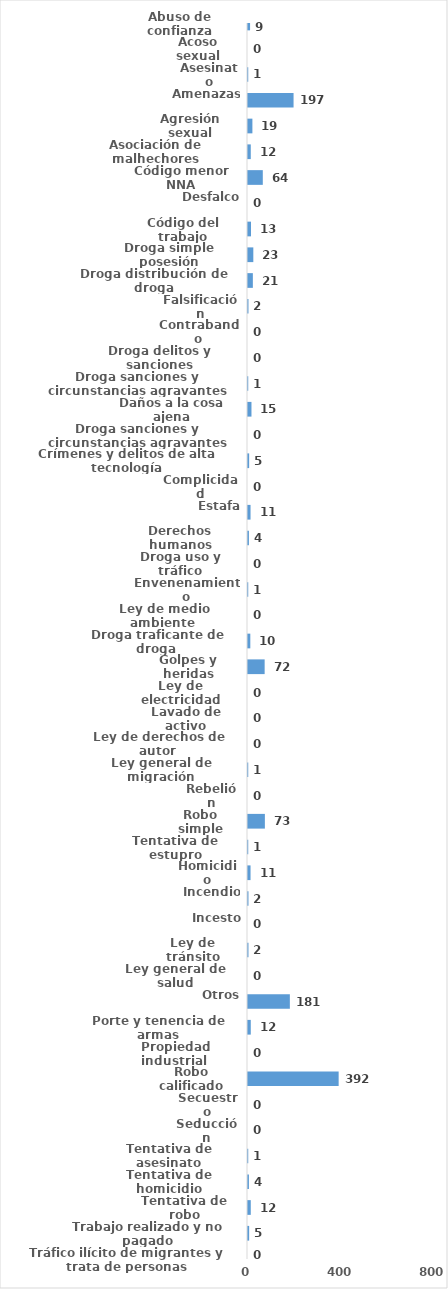
| Category | Series 0 |
|---|---|
| Abuso de confianza | 9 |
| Acoso sexual | 0 |
| Asesinato | 1 |
| Amenazas | 197 |
| Agresión sexual | 19 |
| Asociación de malhechores | 12 |
| Código menor NNA | 64 |
| Desfalco | 0 |
| Código del trabajo | 13 |
| Droga simple posesión | 23 |
| Droga distribución de droga | 21 |
| Falsificación | 2 |
| Contrabando | 0 |
| Droga delitos y sanciones | 0 |
| Droga sanciones y circunstancias agravantes | 1 |
| Daños a la cosa ajena | 15 |
| Droga sanciones y circunstancias agravantes | 0 |
| Crímenes y delitos de alta tecnología | 5 |
| Complicidad | 0 |
| Estafa | 11 |
| Derechos humanos | 4 |
| Droga uso y tráfico | 0 |
| Envenenamiento | 1 |
| Ley de medio ambiente  | 0 |
| Droga traficante de droga  | 10 |
| Golpes y heridas | 72 |
| Ley de electricidad | 0 |
| Lavado de activo | 0 |
| Ley de derechos de autor  | 0 |
| Ley general de migración | 1 |
| Rebelión | 0 |
| Robo simple | 73 |
| Tentativa de estupro | 1 |
| Homicidio | 11 |
| Incendio | 2 |
| Incesto | 0 |
| Ley de tránsito | 2 |
| Ley general de salud | 0 |
| Otros | 181 |
| Porte y tenencia de armas | 12 |
| Propiedad industrial  | 0 |
| Robo calificado | 392 |
| Secuestro | 0 |
| Seducción | 0 |
| Tentativa de asesinato | 1 |
| Tentativa de homicidio | 4 |
| Tentativa de robo | 12 |
| Trabajo realizado y no pagado | 5 |
| Tráfico ilícito de migrantes y trata de personas | 0 |